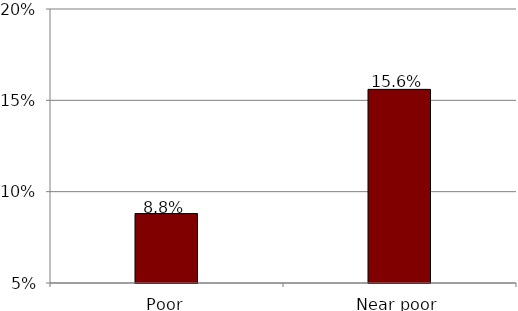
| Category | Series 0 |
|---|---|
| Poor | 0.088 |
| Near poor | 0.156 |